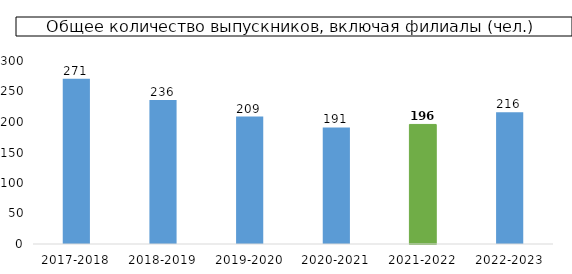
| Category | Series 0 |
|---|---|
| 2017-2018 | 271 |
| 2018-2019 | 236 |
| 2019-2020 | 209 |
| 2020-2021 | 191 |
| 2021-2022 | 196 |
| 2022-2023 | 216 |